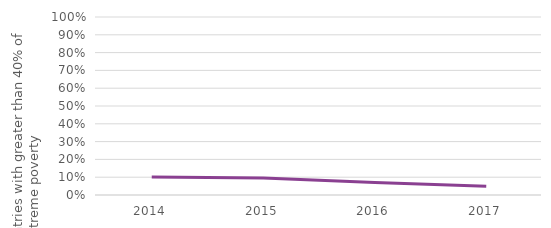
| Category | Above 40% |
|---|---|
| 2014.0 | 0.102 |
| 2015.0 | 0.096 |
| 2016.0 | 0.07 |
| 2017.0 | 0.049 |